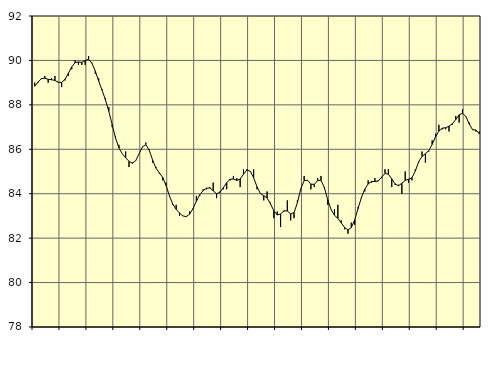
| Category | Piggar | Series 1 |
|---|---|---|
| nan | 89 | 88.84 |
| 87.0 | 89 | 89.03 |
| 87.0 | 89.2 | 89.18 |
| 87.0 | 89.3 | 89.2 |
| nan | 89 | 89.15 |
| 88.0 | 89.2 | 89.13 |
| 88.0 | 89.3 | 89.1 |
| 88.0 | 89 | 89.02 |
| nan | 88.8 | 89.01 |
| 89.0 | 89.1 | 89.15 |
| 89.0 | 89.3 | 89.42 |
| 89.0 | 89.6 | 89.71 |
| nan | 90 | 89.9 |
| 90.0 | 89.8 | 89.93 |
| 90.0 | 89.8 | 89.91 |
| 90.0 | 89.8 | 90 |
| nan | 90.2 | 90.05 |
| 91.0 | 89.9 | 89.87 |
| 91.0 | 89.4 | 89.52 |
| 91.0 | 89.2 | 89.07 |
| nan | 88.7 | 88.66 |
| 92.0 | 88.3 | 88.23 |
| 92.0 | 87.9 | 87.71 |
| 92.0 | 87 | 87.12 |
| nan | 86.6 | 86.51 |
| 93.0 | 86.2 | 86.06 |
| 93.0 | 85.8 | 85.8 |
| 93.0 | 85.9 | 85.62 |
| nan | 85.2 | 85.46 |
| 94.0 | 85.4 | 85.37 |
| 94.0 | 85.5 | 85.49 |
| 94.0 | 85.8 | 85.8 |
| nan | 86.1 | 86.11 |
| 95.0 | 86.3 | 86.21 |
| 95.0 | 86 | 85.96 |
| 95.0 | 85.4 | 85.52 |
| nan | 85.2 | 85.15 |
| 96.0 | 84.9 | 84.94 |
| 96.0 | 84.6 | 84.74 |
| 96.0 | 84.5 | 84.37 |
| nan | 83.9 | 83.91 |
| 97.0 | 83.5 | 83.53 |
| 97.0 | 83.5 | 83.3 |
| 97.0 | 83 | 83.13 |
| nan | 83 | 83 |
| 98.0 | 83 | 82.97 |
| 98.0 | 83.2 | 83.08 |
| 98.0 | 83.3 | 83.33 |
| nan | 83.9 | 83.66 |
| 99.0 | 83.9 | 83.95 |
| 99.0 | 84.2 | 84.14 |
| 99.0 | 84.2 | 84.25 |
| nan | 84.3 | 84.26 |
| 0.0 | 84.5 | 84.13 |
| 0.0 | 83.8 | 84 |
| 0.0 | 84.1 | 84.06 |
| nan | 84.2 | 84.27 |
| 1.0 | 84.2 | 84.5 |
| 1.0 | 84.6 | 84.65 |
| 1.0 | 84.8 | 84.66 |
| nan | 84.7 | 84.6 |
| 2.0 | 84.3 | 84.66 |
| 2.0 | 85.1 | 84.88 |
| 2.0 | 85.1 | 85.07 |
| nan | 85 | 85.01 |
| 3.0 | 85.1 | 84.72 |
| 3.0 | 84.2 | 84.31 |
| 3.0 | 84 | 84.01 |
| nan | 83.7 | 83.91 |
| 4.0 | 84.1 | 83.81 |
| 4.0 | 83.6 | 83.55 |
| 4.0 | 82.9 | 83.23 |
| nan | 83.2 | 83.04 |
| 5.0 | 82.5 | 83.09 |
| 5.0 | 83.2 | 83.23 |
| 5.0 | 83.7 | 83.22 |
| nan | 82.8 | 83.09 |
| 6.0 | 82.9 | 83.15 |
| 6.0 | 83.7 | 83.6 |
| 6.0 | 84.2 | 84.22 |
| nan | 84.8 | 84.59 |
| 7.0 | 84.6 | 84.61 |
| 7.0 | 84.2 | 84.43 |
| 7.0 | 84.3 | 84.42 |
| nan | 84.7 | 84.59 |
| 8.0 | 84.8 | 84.61 |
| 8.0 | 84.3 | 84.27 |
| 8.0 | 83.5 | 83.72 |
| nan | 83.3 | 83.29 |
| 9.0 | 83.3 | 83.03 |
| 9.0 | 83.5 | 82.89 |
| 9.0 | 82.8 | 82.69 |
| nan | 82.4 | 82.48 |
| 10.0 | 82.2 | 82.37 |
| 10.0 | 82.7 | 82.48 |
| 10.0 | 82.6 | 82.82 |
| nan | 83.4 | 83.33 |
| 11.0 | 83.8 | 83.83 |
| 11.0 | 84.1 | 84.21 |
| 11.0 | 84.6 | 84.44 |
| nan | 84.5 | 84.55 |
| 12.0 | 84.7 | 84.55 |
| 12.0 | 84.6 | 84.57 |
| 12.0 | 84.7 | 84.75 |
| nan | 85.1 | 84.91 |
| 13.0 | 85.1 | 84.88 |
| 13.0 | 84.3 | 84.67 |
| 13.0 | 84.4 | 84.44 |
| nan | 84.4 | 84.36 |
| 14.0 | 84 | 84.47 |
| 14.0 | 85 | 84.6 |
| 14.0 | 84.5 | 84.65 |
| nan | 84.6 | 84.72 |
| 15.0 | 85.1 | 85.02 |
| 15.0 | 85.4 | 85.44 |
| 15.0 | 85.9 | 85.68 |
| nan | 85.4 | 85.8 |
| 16.0 | 85.9 | 85.94 |
| 16.0 | 86.4 | 86.22 |
| 16.0 | 86.7 | 86.56 |
| nan | 87.1 | 86.82 |
| 17.0 | 86.9 | 86.95 |
| 17.0 | 86.9 | 86.97 |
| 17.0 | 86.8 | 87.04 |
| nan | 87.1 | 87.15 |
| 18.0 | 87.5 | 87.34 |
| 18.0 | 87.2 | 87.55 |
| 18.0 | 87.8 | 87.62 |
| nan | 87.5 | 87.48 |
| 19.0 | 87.2 | 87.14 |
| 19.0 | 86.9 | 86.88 |
| 19.0 | 86.8 | 86.87 |
| nan | 86.8 | 86.7 |